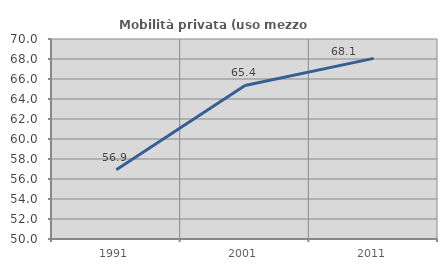
| Category | Mobilità privata (uso mezzo privato) |
|---|---|
| 1991.0 | 56.923 |
| 2001.0 | 65.357 |
| 2011.0 | 68.063 |